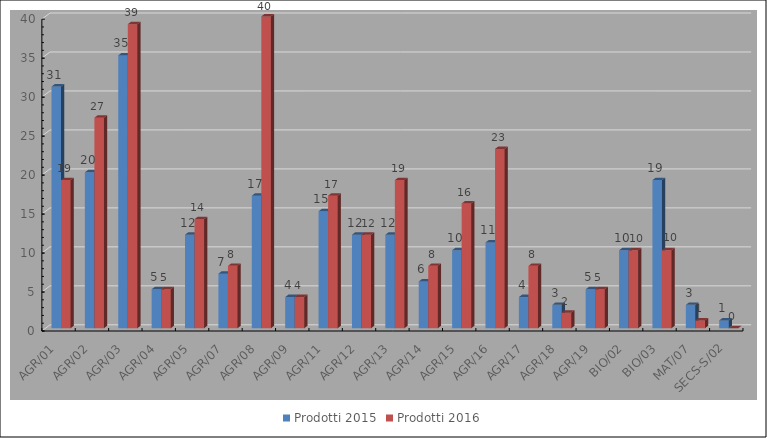
| Category | Prodotti 2015 | Prodotti 2016 |
|---|---|---|
| AGR/01 | 31 | 19 |
| AGR/02 | 20 | 27 |
| AGR/03 | 35 | 39 |
| AGR/04 | 5 | 5 |
| AGR/05 | 12 | 14 |
| AGR/07 | 7 | 8 |
| AGR/08 | 17 | 40 |
| AGR/09 | 4 | 4 |
| AGR/11 | 15 | 17 |
| AGR/12 | 12 | 12 |
| AGR/13 | 12 | 19 |
| AGR/14 | 6 | 8 |
| AGR/15 | 10 | 16 |
| AGR/16 | 11 | 23 |
| AGR/17 | 4 | 8 |
| AGR/18 | 3 | 2 |
| AGR/19 | 5 | 5 |
| BIO/02 | 10 | 10 |
| BIO/03 | 19 | 10 |
| MAT/07 | 3 | 1 |
| SECS-S/02 | 1 | 0 |